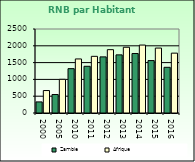
| Category | Zambie | Afrique                        |
|---|---|---|
| 2000.0 | 330 | 668.557 |
| 2005.0 | 550 | 1002.896 |
| 2010.0 | 1320 | 1608.999 |
| 2011.0 | 1390 | 1686.521 |
| 2012.0 | 1670 | 1885.129 |
| 2013.0 | 1730 | 1956.671 |
| 2014.0 | 1770 | 2022.289 |
| 2015.0 | 1560 | 1932.283 |
| 2016.0 | 1360 | 1781.415 |